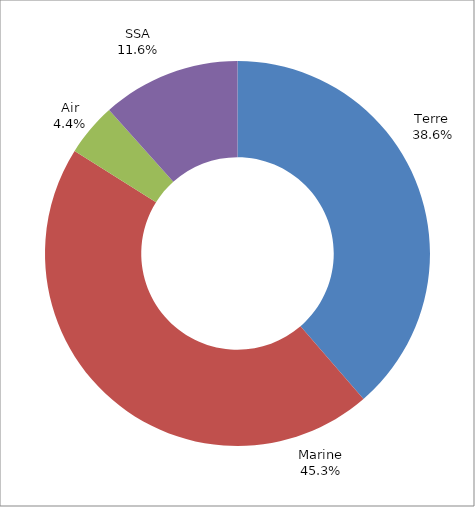
| Category | 2014 |
|---|---|
| Terre  | 645 |
| Marine | 756 |
| Air | 74 |
| SSA | 194 |